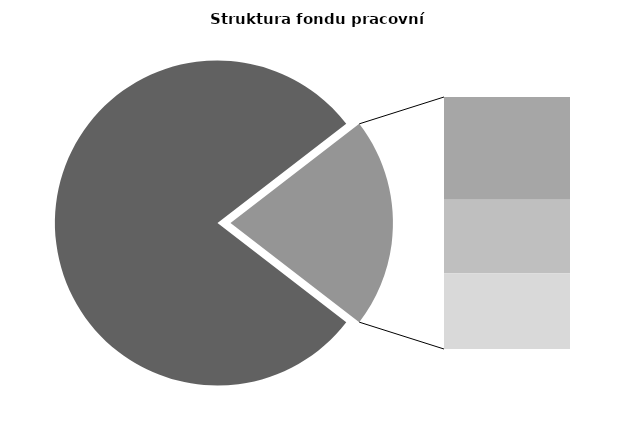
| Category | Series 0 |
|---|---|
| Průměrná měsíční odpracovaná doba bez přesčasu | 134.074 |
| Dovolená | 14.449 |
| Nemoc | 10.299 |
| Jiné | 10.653 |